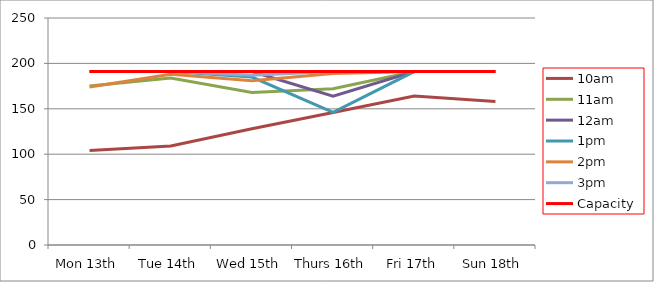
| Category | 9am | 10am | 11am | 12am | 1pm | 2pm | 3pm | 4pm | 5pm | Capacity |
|---|---|---|---|---|---|---|---|---|---|---|
| Mon 13th |  | 104 | 175 | 191 | 191 | 174 | 191 |  |  | 191 |
| Tue 14th |  | 109 | 184 | 191 | 191 | 188 | 191 |  |  | 191 |
| Wed 15th |  | 128 | 168 | 191 | 185 | 181 | 187 |  |  | 191 |
| Thurs 16th |  | 146 | 172 | 164 | 146 | 189 | 191 |  |  | 191 |
| Fri 17th |  | 164 | 191 | 191 | 191 | 191 | 191 |  |  | 191 |
| Sun 18th |  | 158 | 191 | 191 | 191 | 191 | 191 |  |  | 191 |